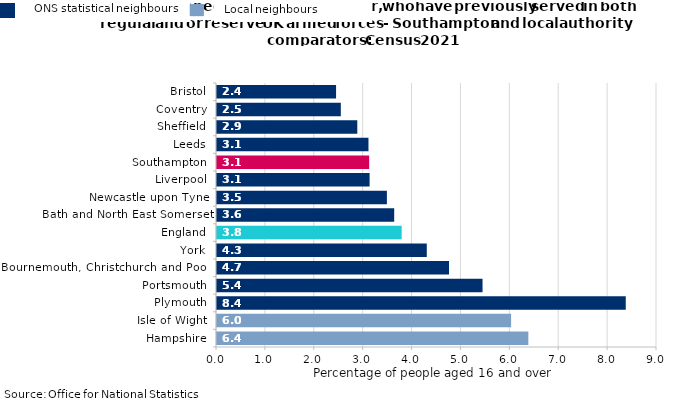
| Category | Previously served in both regular and or reserve UK armed forces |
|---|---|
| Hampshire | 6.368 |
| Isle of Wight | 6.016 |
| Plymouth | 8.361 |
| Portsmouth | 5.431 |
| Bournemouth, Christchurch and Poole | 4.746 |
| York | 4.291 |
| England | 3.777 |
| Bath and North East Somerset | 3.625 |
| Newcastle upon Tyne | 3.475 |
| Liverpool | 3.121 |
| Southampton | 3.113 |
| Leeds | 3.098 |
| Sheffield | 2.87 |
| Coventry | 2.533 |
| Bristol | 2.435 |